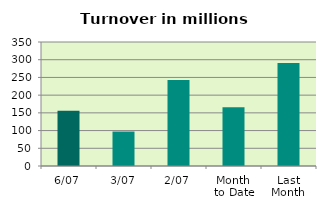
| Category | Series 0 |
|---|---|
| 6/07 | 156.263 |
| 3/07 | 97.256 |
| 2/07 | 242.794 |
| Month 
to Date | 166.081 |
| Last
Month | 290.981 |